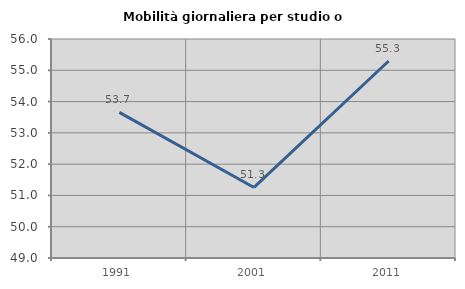
| Category | Mobilità giornaliera per studio o lavoro |
|---|---|
| 1991.0 | 53.655 |
| 2001.0 | 51.255 |
| 2011.0 | 55.297 |